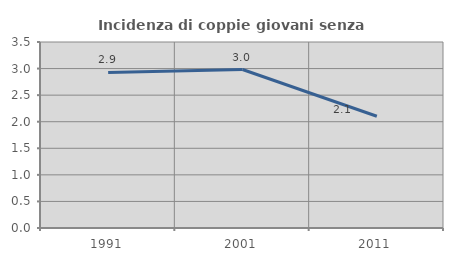
| Category | Incidenza di coppie giovani senza figli |
|---|---|
| 1991.0 | 2.927 |
| 2001.0 | 2.982 |
| 2011.0 | 2.103 |